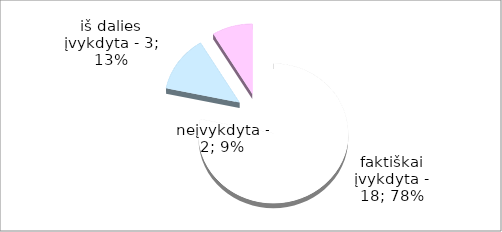
| Category | Series 0 |
|---|---|
| 0 | 18 |
| 1 | 3 |
| 2 | 2 |